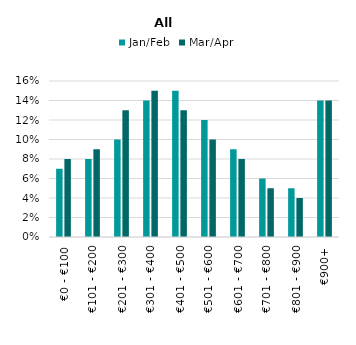
| Category | Jan/Feb | Mar/Apr |
|---|---|---|
| €0 - €100 | 0.07 | 0.08 |
| €101 - €200 | 0.08 | 0.09 |
| €201 - €300 | 0.1 | 0.13 |
| €301 - €400 | 0.14 | 0.15 |
| €401 - €500 | 0.15 | 0.13 |
| €501 - €600 | 0.12 | 0.1 |
| €601 - €700 | 0.09 | 0.08 |
| €701 - €800 | 0.06 | 0.05 |
| €801 - €900 | 0.05 | 0.04 |
| €900+ | 0.14 | 0.14 |